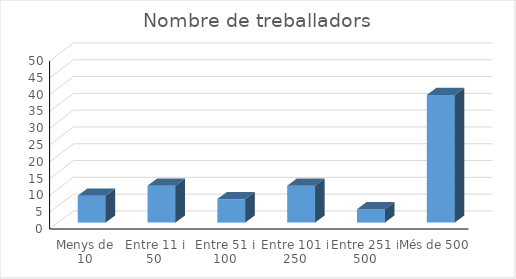
| Category | Series 0 |
|---|---|
| Menys de 10 | 8 |
| Entre 11 i 50 | 11 |
| Entre 51 i 100 | 7 |
| Entre 101 i 250 | 11 |
| Entre 251 i 500 | 4 |
| Més de 500 | 38 |